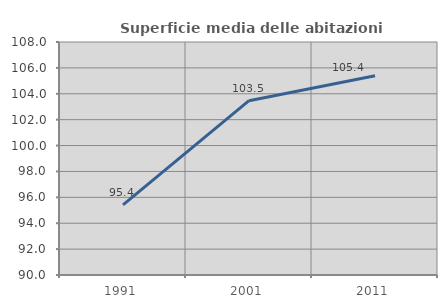
| Category | Superficie media delle abitazioni occupate |
|---|---|
| 1991.0 | 95.419 |
| 2001.0 | 103.467 |
| 2011.0 | 105.397 |